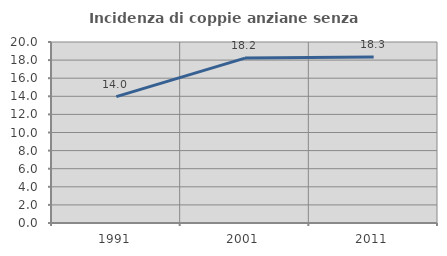
| Category | Incidenza di coppie anziane senza figli  |
|---|---|
| 1991.0 | 13.964 |
| 2001.0 | 18.224 |
| 2011.0 | 18.346 |